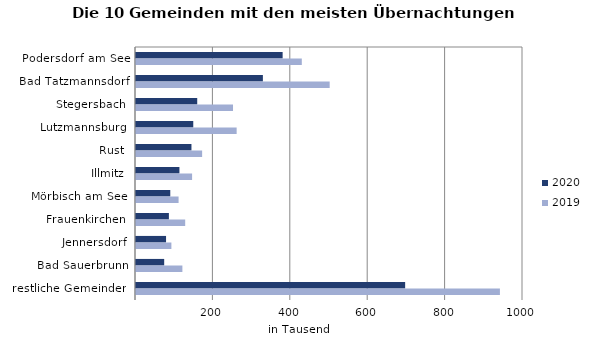
| Category | 2020 | 2019 |
|---|---|---|
| Podersdorf am See | 378898 | 428417 |
| Bad Tatzmannsdorf | 327865 | 500456 |
| Stegersbach | 158194 | 250675 |
| Lutzmannsburg | 147969 | 260076 |
| Rust | 143281 | 170883 |
| Illmitz | 112204 | 144929 |
| Mörbisch am See | 88570 | 110023 |
| Frauenkirchen | 84981 | 127115 |
| Jennersdorf | 77655 | 91435 |
| Bad Sauerbrunn | 72842 | 119861 |
| restliche Gemeinden | 695477 | 940362 |